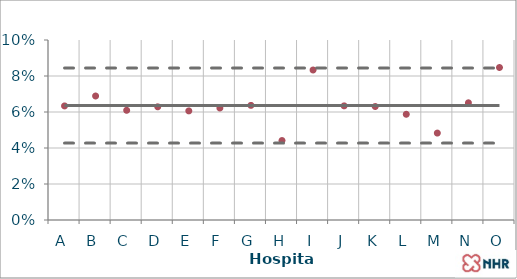
| Category | chronische totale occlusie | gemiddelde | gemiddelde-2SD | gemiddelde+2SD |
|---|---|---|---|---|
| A | 0.063 | 0.064 | 0.043 | 0.084 |
| B | 0.069 | 0.064 | 0.043 | 0.084 |
| C | 0.061 | 0.064 | 0.043 | 0.084 |
| D | 0.063 | 0.064 | 0.043 | 0.084 |
| E | 0.061 | 0.064 | 0.043 | 0.084 |
| F | 0.062 | 0.064 | 0.043 | 0.084 |
| G | 0.064 | 0.064 | 0.043 | 0.084 |
| H | 0.044 | 0.064 | 0.043 | 0.084 |
| I | 0.083 | 0.064 | 0.043 | 0.084 |
| J | 0.063 | 0.064 | 0.043 | 0.084 |
| K | 0.063 | 0.064 | 0.043 | 0.084 |
| L | 0.059 | 0.064 | 0.043 | 0.084 |
| M | 0.048 | 0.064 | 0.043 | 0.084 |
| N | 0.065 | 0.064 | 0.043 | 0.084 |
| O | 0.085 | 0.064 | 0.043 | 0.084 |